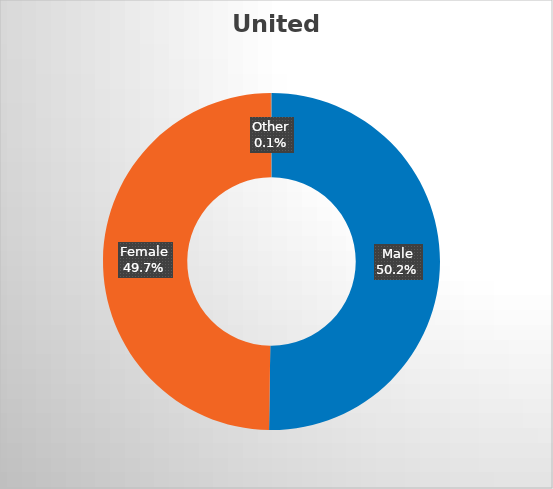
| Category | United States  |
|---|---|
| Male | 0.502 |
| Female | 0.497 |
| Other | 0.001 |